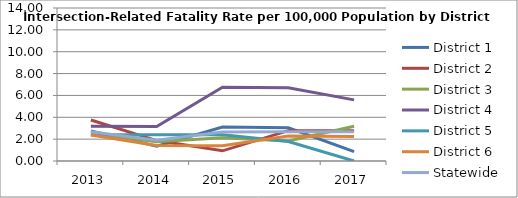
| Category | District 1 | District 2 | District 3 | District 4 | District 5 | District 6 | Statewide |
|---|---|---|---|---|---|---|---|
| 2013.0 | 2.758 | 3.753 | 2.492 | 3.177 | 2.408 | 2.375 | 2.667 |
| 2014.0 | 1.355 | 1.869 | 1.764 | 3.15 | 2.406 | 1.413 | 1.897 |
| 2015.0 | 3.111 | 0.931 | 2.134 | 6.757 | 2.403 | 1.401 | 2.659 |
| 2016.0 | 3.043 | 2.776 | 1.83 | 6.703 | 1.788 | 2.291 | 2.674 |
| 2017.0 | 0.852 | 2.764 | 3.185 | 5.592 | 0 | 2.25 | 2.679 |